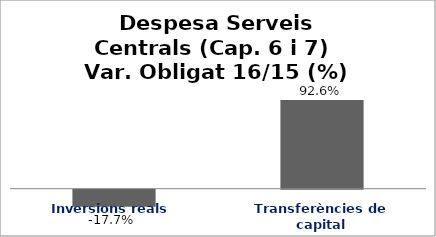
| Category | Series 0 |
|---|---|
| Inversions reals | -0.177 |
| Transferències de capital | 0.926 |